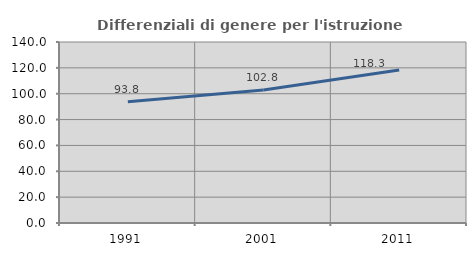
| Category | Differenziali di genere per l'istruzione superiore |
|---|---|
| 1991.0 | 93.826 |
| 2001.0 | 102.843 |
| 2011.0 | 118.287 |